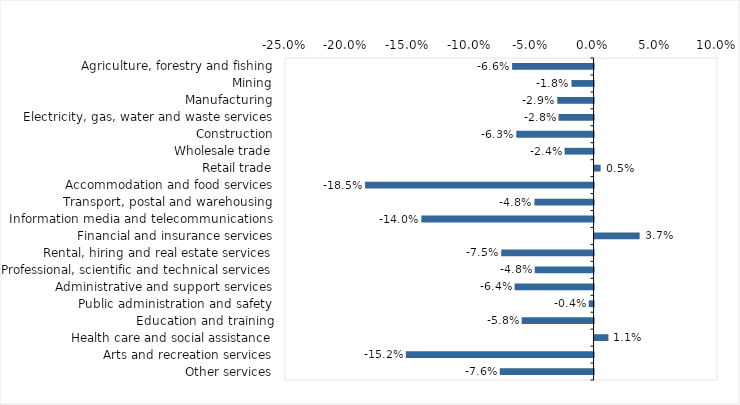
| Category | This week |
|---|---|
| Agriculture, forestry and fishing | -0.066 |
| Mining | -0.018 |
| Manufacturing | -0.029 |
| Electricity, gas, water and waste services | -0.028 |
| Construction | -0.063 |
| Wholesale trade | -0.024 |
| Retail trade | 0.005 |
| Accommodation and food services | -0.185 |
| Transport, postal and warehousing | -0.048 |
| Information media and telecommunications | -0.14 |
| Financial and insurance services | 0.036 |
| Rental, hiring and real estate services | -0.075 |
| Professional, scientific and technical services | -0.048 |
| Administrative and support services | -0.064 |
| Public administration and safety | -0.004 |
| Education and training | -0.058 |
| Health care and social assistance | 0.011 |
| Arts and recreation services | -0.152 |
| Other services | -0.076 |